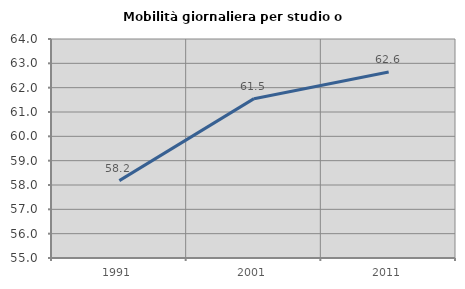
| Category | Mobilità giornaliera per studio o lavoro |
|---|---|
| 1991.0 | 58.179 |
| 2001.0 | 61.548 |
| 2011.0 | 62.647 |